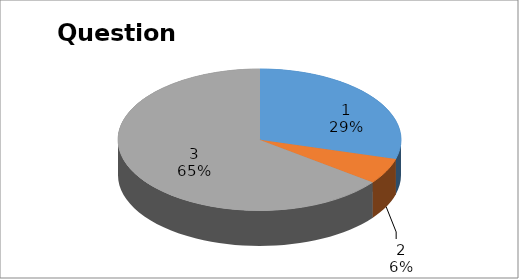
| Category | Series 0 |
|---|---|
| 0 | 5 |
| 1 | 1 |
| 2 | 11 |